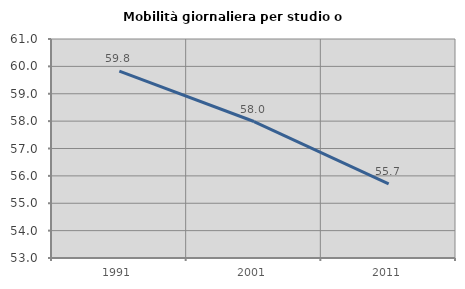
| Category | Mobilità giornaliera per studio o lavoro |
|---|---|
| 1991.0 | 59.823 |
| 2001.0 | 57.985 |
| 2011.0 | 55.711 |